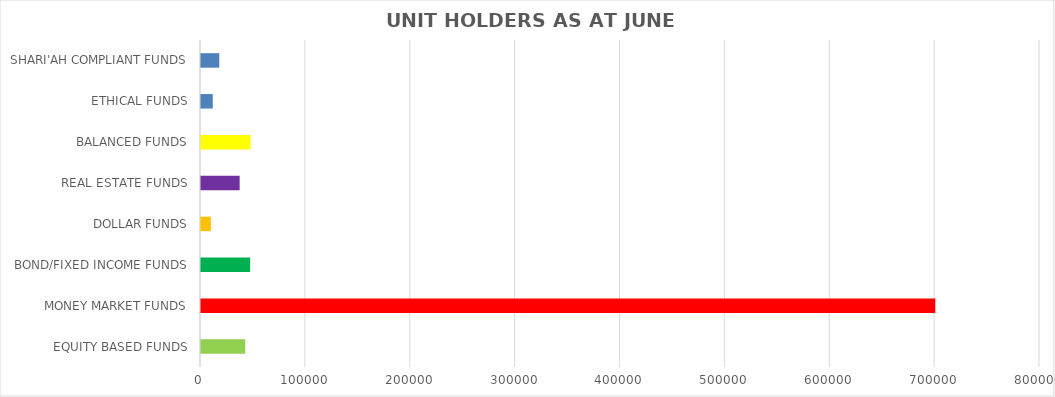
| Category | JUNE '22  |
|---|---|
| EQUITY BASED FUNDS | 42181 |
| MONEY MARKET FUNDS | 700158 |
| BOND/FIXED INCOME FUNDS | 46859 |
| DOLLAR FUNDS | 9394 |
| REAL ESTATE FUNDS | 36858 |
| BALANCED FUNDS | 47243 |
| ETHICAL FUNDS | 11226 |
| SHARI'AH COMPLIANT FUNDS | 17457 |